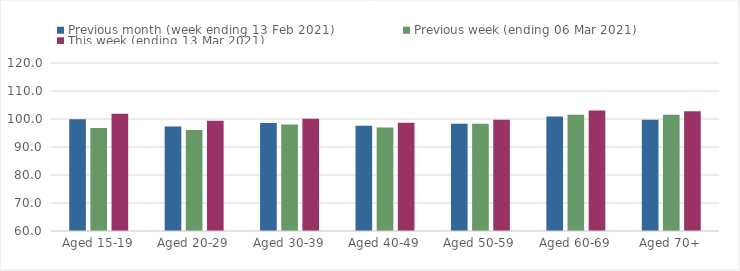
| Category | Previous month (week ending 13 Feb 2021) | Previous week (ending 06 Mar 2021) | This week (ending 13 Mar 2021) |
|---|---|---|---|
| Aged 15-19 | 99.94 | 96.8 | 101.9 |
| Aged 20-29 | 97.3 | 96.09 | 99.34 |
| Aged 30-39 | 98.61 | 98.02 | 100.1 |
| Aged 40-49 | 97.56 | 96.99 | 98.63 |
| Aged 50-59 | 98.3 | 98.28 | 99.77 |
| Aged 60-69 | 100.85 | 101.5 | 103.05 |
| Aged 70+ | 99.75 | 101.54 | 102.81 |